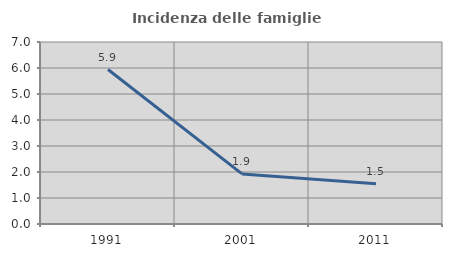
| Category | Incidenza delle famiglie numerose |
|---|---|
| 1991.0 | 5.941 |
| 2001.0 | 1.927 |
| 2011.0 | 1.546 |